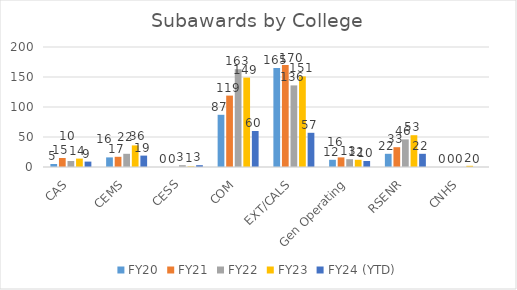
| Category | FY20 | FY21 | FY22 | FY23 | FY24 (YTD) |
|---|---|---|---|---|---|
| CAS | 5 | 15 | 10 | 14 | 9 |
| CEMS | 16 | 17 | 22 | 36 | 19 |
| CESS | 0 | 0 | 3 | 1 | 3 |
| COM | 87 | 119 | 163 | 149 | 60 |
| EXT/CALS | 165 | 170 | 136 | 151 | 57 |
| Gen Operating | 12 | 16 | 13 | 12 | 10 |
| RSENR | 22 | 33 | 46 | 53 | 22 |
| CNHS | 0 | 0 | 0 | 2 | 0 |